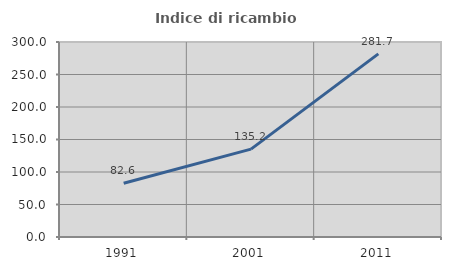
| Category | Indice di ricambio occupazionale  |
|---|---|
| 1991.0 | 82.597 |
| 2001.0 | 135.152 |
| 2011.0 | 281.657 |